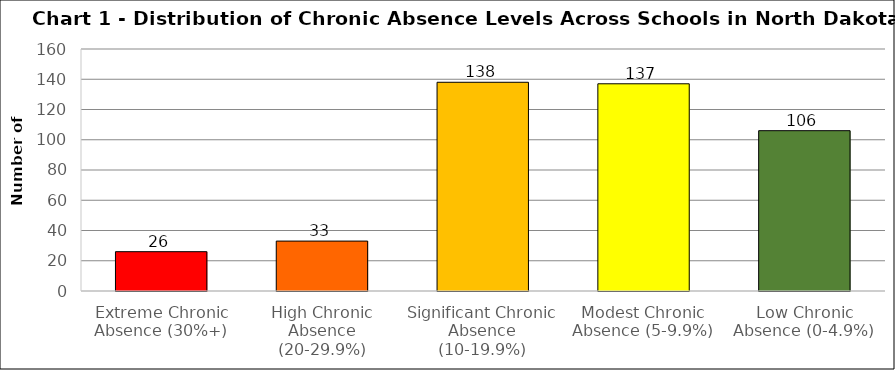
| Category | Series 0 |
|---|---|
| Extreme Chronic Absence (30%+) | 26 |
| High Chronic Absence (20-29.9%) | 33 |
| Significant Chronic Absence (10-19.9%) | 138 |
| Modest Chronic Absence (5-9.9%) | 137 |
| Low Chronic Absence (0-4.9%) | 106 |